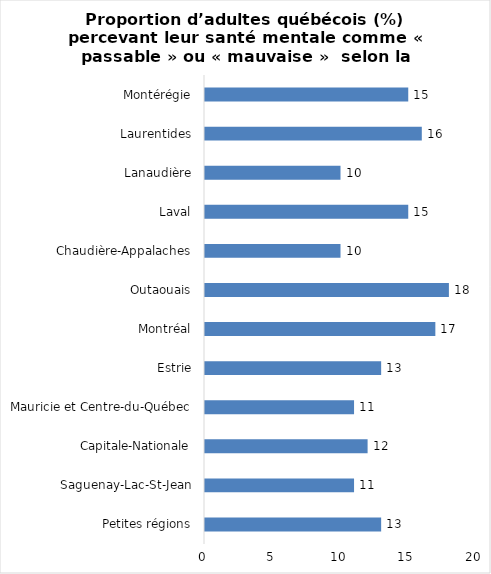
| Category | Series 0 |
|---|---|
| Petites régions | 13 |
| Saguenay-Lac-St-Jean | 11 |
| Capitale-Nationale | 12 |
| Mauricie et Centre-du-Québec | 11 |
| Estrie | 13 |
| Montréal | 17 |
| Outaouais | 18 |
| Chaudière-Appalaches | 10 |
| Laval | 15 |
| Lanaudière | 10 |
| Laurentides | 16 |
| Montérégie | 15 |